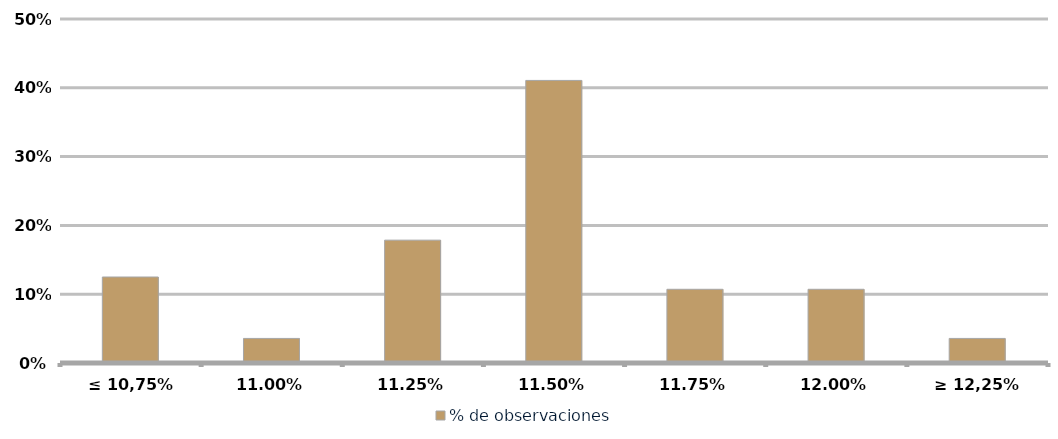
| Category | % de observaciones  |
|---|---|
| ≤ 10,75% | 0.125 |
| 11,00% | 0.036 |
| 11,25% | 0.179 |
| 11,50% | 0.411 |
| 11,75% | 0.107 |
| 12,00% | 0.107 |
| ≥ 12,25% | 0.036 |